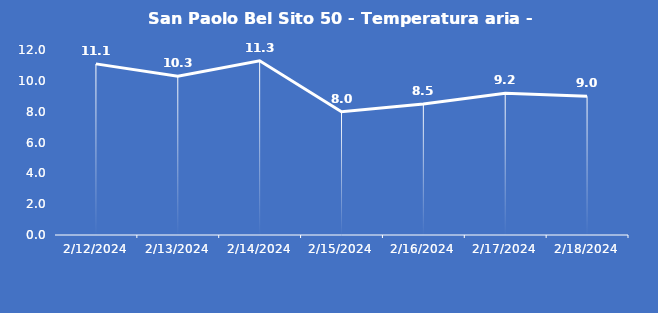
| Category | San Paolo Bel Sito 50 - Temperatura aria - Grezzo (°C) |
|---|---|
| 2/12/24 | 11.1 |
| 2/13/24 | 10.3 |
| 2/14/24 | 11.3 |
| 2/15/24 | 8 |
| 2/16/24 | 8.5 |
| 2/17/24 | 9.2 |
| 2/18/24 | 9 |